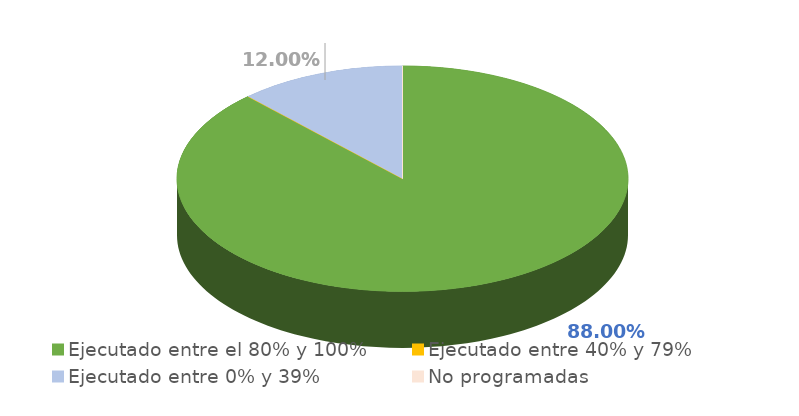
| Category | Series 0 |
|---|---|
| Ejecutado entre el 80% y 100% | 0.88 |
| Ejecutado entre 40% y 79% | 0 |
| Ejecutado entre 0% y 39% | 0.12 |
| No programadas | 0 |